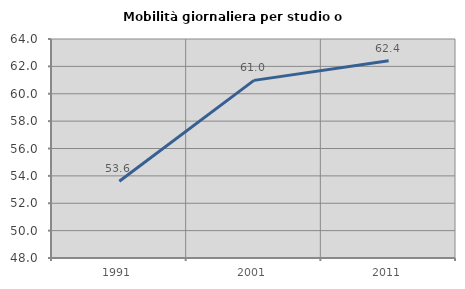
| Category | Mobilità giornaliera per studio o lavoro |
|---|---|
| 1991.0 | 53.608 |
| 2001.0 | 60.978 |
| 2011.0 | 62.41 |